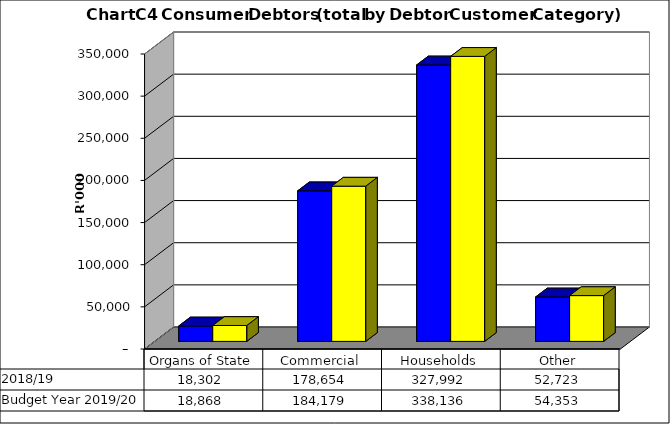
| Category |  2018/19  | Budget Year 2019/20 |
|---|---|---|
| Organs of State | 18301705.53 | 18867737.66 |
| Commercial | 178653603.092 | 184178972.26 |
| Households | 327991763.665 | 338135838.83 |
| Other | 52722779.803 | 54353381.24 |